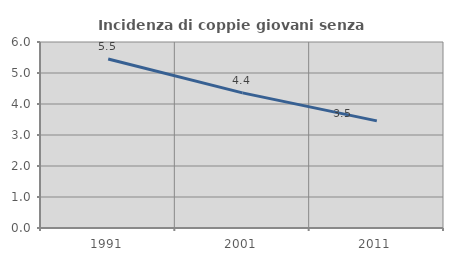
| Category | Incidenza di coppie giovani senza figli |
|---|---|
| 1991.0 | 5.451 |
| 2001.0 | 4.359 |
| 2011.0 | 3.455 |